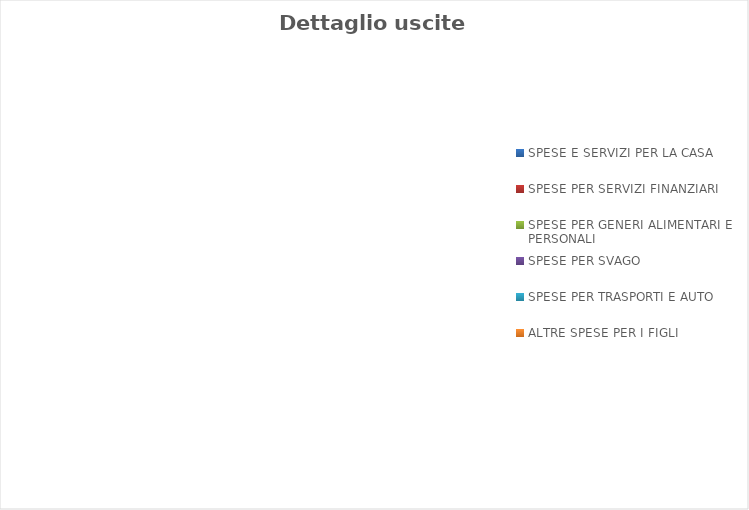
| Category | Series 0 |
|---|---|
| SPESE E SERVIZI PER LA CASA | 0 |
| SPESE PER SERVIZI FINANZIARI | 0 |
| SPESE PER GENERI ALIMENTARI E PERSONALI | 0 |
| SPESE PER SVAGO | 0 |
| SPESE PER TRASPORTI E AUTO | 0 |
| ALTRE SPESE PER I FIGLI | 0 |